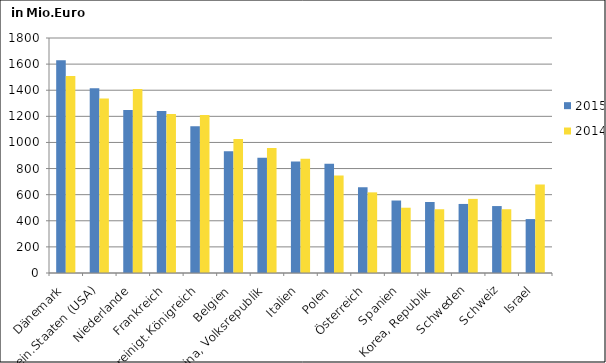
| Category | 2015 | 2014 |
|---|---|---|
| Dänemark | 1630.075 | 1508.335 |
| Verein.Staaten (USA) | 1415.937 | 1336.075 |
| Niederlande | 1248.108 | 1408.491 |
| Frankreich | 1241.459 | 1218.678 |
| Vereinigt.Königreich | 1123.245 | 1210.601 |
| Belgien | 933.372 | 1026.329 |
| China, Volksrepublik | 882.492 | 957.827 |
| Italien | 854.484 | 874.719 |
| Polen | 835.96 | 746.426 |
| Österreich | 656.107 | 617.645 |
| Spanien | 555.19 | 499.951 |
| Korea, Republik | 544.062 | 488.329 |
| Schweden | 528.909 | 567.706 |
| Schweiz | 512.735 | 488.404 |
| Israel | 413.033 | 678.632 |